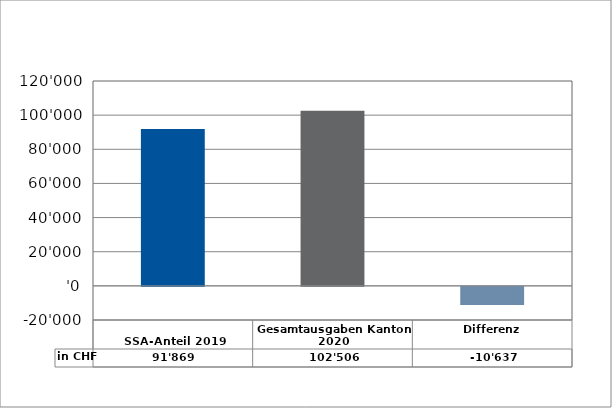
| Category | in CHF |
|---|---|
| 
SSA-Anteil 2019

 | 91869 |
| Gesamtausgaben Kanton 2020
 | 102506.15 |
| Differenz | -10637.15 |